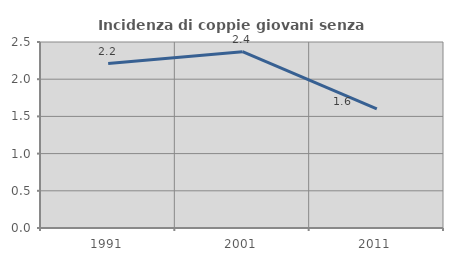
| Category | Incidenza di coppie giovani senza figli |
|---|---|
| 1991.0 | 2.211 |
| 2001.0 | 2.37 |
| 2011.0 | 1.6 |